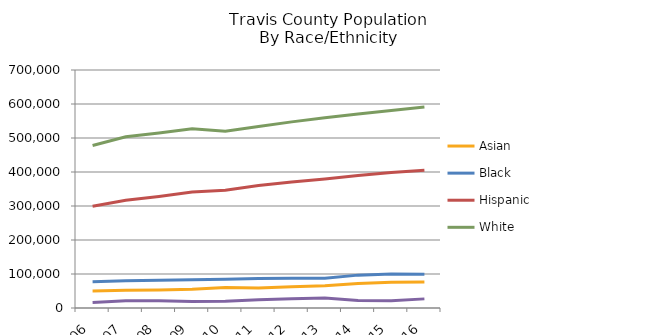
| Category | Asian | Black | Hispanic | White | Other Race or 2 or More Races |
|---|---|---|---|---|---|
| 2006.0 | 50151 | 77403 | 299239 | 478087 | 16126 |
| 2007.0 | 52105 | 80311 | 316643 | 503830 | 21476 |
| 2008.0 | 53229 | 81276 | 328217 | 514703 | 21118 |
| 2009.0 | 55078 | 82860 | 341435 | 527528 | 19257 |
| 2010.0 | 60491 | 84303 | 346529 | 519591 | 19892 |
| 2011.0 | 58583 | 86727 | 360086 | 533671 | 24063 |
| 2012.0 | 62387 | 87744 | 370741 | 547393 | 27319 |
| 2013.0 | 65405 | 87387 | 379331 | 559293 | 29538 |
| 2014.0 | 71971 | 96683 | 389834 | 570544 | 22113 |
| 2015.0 | 75784 | 100301 | 398770 | 580542 | 21161 |
| 2016.0 | 76749 | 99449 | 405447 | 590845 | 26833 |